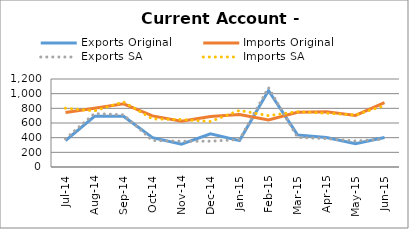
| Category | Exports Original | Imports Original | Exports SA | Imports SA |
|---|---|---|---|---|
| 2014-07-11 | 359 | 742 | 385 | 801 |
| 2014-08-11 | 691 | 802 | 729 | 765 |
| 2014-09-11 | 693 | 861 | 712 | 888 |
| 2014-10-11 | 401 | 697 | 361 | 656 |
| 2014-11-11 | 310 | 623 | 351 | 647 |
| 2014-12-11 | 453 | 689 | 352 | 621 |
| 2015-01-11 | 360 | 715 | 374 | 771 |
| 2015-02-11 | 1043 | 641 | 1082 | 700 |
| 2015-03-11 | 438 | 745 | 404 | 754 |
| 2015-04-11 | 403 | 752 | 387 | 733 |
| 2015-05-11 | 318 | 703 | 355 | 709 |
| 2015-06-11 | 403 | 878 | 380 | 838 |